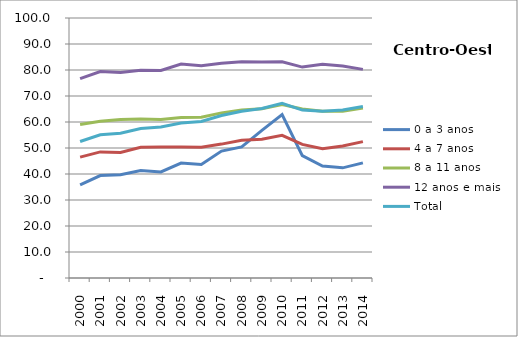
| Category | 0 a 3 anos | 4 a 7 anos | 8 a 11 anos | 12 anos e mais | Total |
|---|---|---|---|---|---|
| 2000.0 | 35.8 | 46.5 | 59 | 76.7 | 52.5 |
| 2001.0 | 39.4 | 48.5 | 60.3 | 79.4 | 55.1 |
| 2002.0 | 39.7 | 48.3 | 61 | 79 | 55.7 |
| 2003.0 | 41.3 | 50.3 | 61.2 | 79.9 | 57.5 |
| 2004.0 | 40.8 | 50.4 | 61 | 79.8 | 58.1 |
| 2005.0 | 44.2 | 50.4 | 61.7 | 82.3 | 59.6 |
| 2006.0 | 43.7 | 50.3 | 61.8 | 81.6 | 60.2 |
| 2007.0 | 48.8 | 51.5 | 63.5 | 82.6 | 62.5 |
| 2008.0 | 50.4 | 53 | 64.6 | 83.2 | 64.1 |
| 2009.0 | 56.8 | 53.4 | 65.1 | 83.1 | 65.2 |
| 2010.0 | 62.827 | 54.887 | 66.676 | 83.126 | 67.156 |
| 2011.0 | 47.067 | 51.381 | 65.023 | 81.123 | 64.579 |
| 2012.0 | 43.045 | 49.702 | 64.122 | 82.232 | 64.134 |
| 2013.0 | 42.363 | 50.774 | 64.127 | 81.511 | 64.618 |
| 2014.0 | 44.289 | 52.465 | 65.399 | 80.238 | 65.936 |